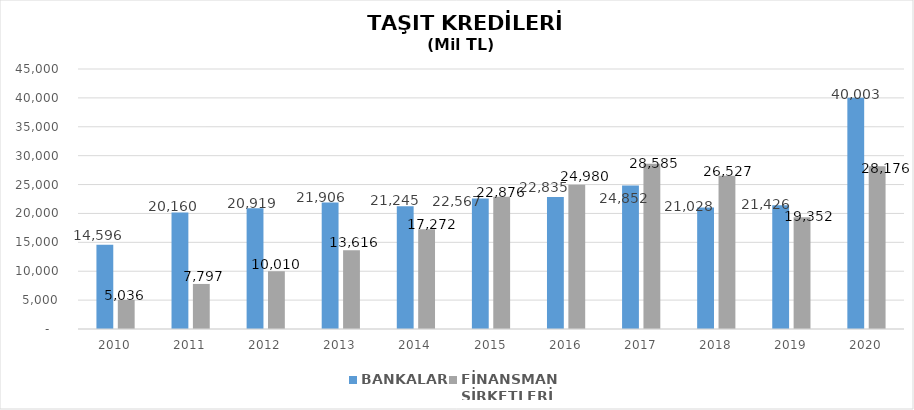
| Category | BANKALAR | FİNANSMAN 
ŞİRKETLERİ |
|---|---|---|
| 2010 | 14596 | 5035.89 |
| 2011 | 20160 | 7796.854 |
| 2012 | 20919 | 10009.755 |
| 2013 | 21906 | 13616.036 |
| 2014 | 21245 | 17271.844 |
| 2015 | 22567 | 22875.563 |
| 2016 | 22835 | 24980.231 |
| 2017 | 24852 | 28584.938 |
| 2018 | 21028 | 26527.133 |
| 2019 | 21426.2 | 19352.327 |
| 2020 | 40002.96 | 28176.3 |